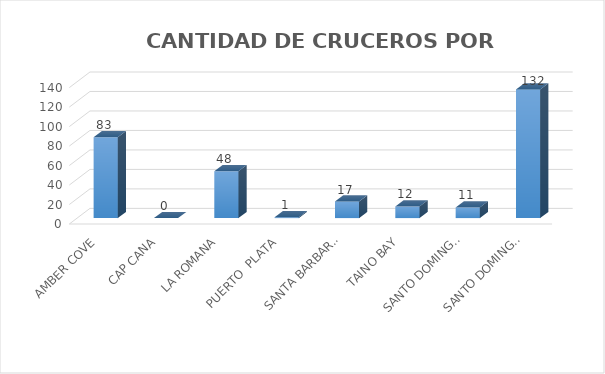
| Category | Series 0 |
|---|---|
| AMBER COVE | 83 |
| CAP CANA | 0 |
| LA ROMANA | 48 |
| PUERTO  PLATA | 1 |
| SANTA BARBARA (SAMANA) | 17 |
| TAINO BAY | 12 |
| SANTO DOMINGO (CRUCERO) | 11 |
| SANTO DOMINGO (FERRY) | 132 |